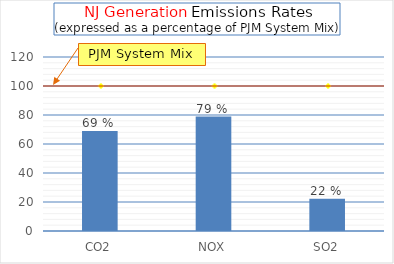
| Category | NJ Generation (%)  |
|---|---|
| CO2 | 68.998 |
| NOX | 78.947 |
| SO2 | 22.222 |